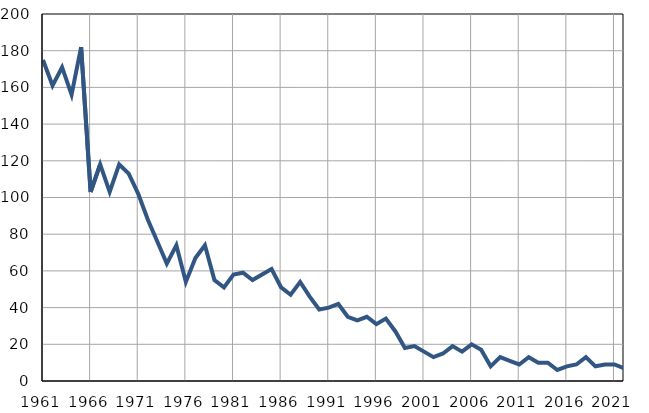
| Category | Infants
deaths |
|---|---|
| 1961.0 | 175 |
| 1962.0 | 161 |
| 1963.0 | 171 |
| 1964.0 | 156 |
| 1965.0 | 182 |
| 1966.0 | 103 |
| 1967.0 | 118 |
| 1968.0 | 103 |
| 1969.0 | 118 |
| 1970.0 | 113 |
| 1971.0 | 102 |
| 1972.0 | 88 |
| 1973.0 | 76 |
| 1974.0 | 64 |
| 1975.0 | 74 |
| 1976.0 | 54 |
| 1977.0 | 67 |
| 1978.0 | 74 |
| 1979.0 | 55 |
| 1980.0 | 51 |
| 1981.0 | 58 |
| 1982.0 | 59 |
| 1983.0 | 55 |
| 1984.0 | 58 |
| 1985.0 | 61 |
| 1986.0 | 51 |
| 1987.0 | 47 |
| 1988.0 | 54 |
| 1989.0 | 46 |
| 1990.0 | 39 |
| 1991.0 | 40 |
| 1992.0 | 42 |
| 1993.0 | 35 |
| 1994.0 | 33 |
| 1995.0 | 35 |
| 1996.0 | 31 |
| 1997.0 | 34 |
| 1998.0 | 27 |
| 1999.0 | 18 |
| 2000.0 | 19 |
| 2001.0 | 16 |
| 2002.0 | 13 |
| 2003.0 | 15 |
| 2004.0 | 19 |
| 2005.0 | 16 |
| 2006.0 | 20 |
| 2007.0 | 17 |
| 2008.0 | 8 |
| 2009.0 | 13 |
| 2010.0 | 11 |
| 2011.0 | 9 |
| 2012.0 | 13 |
| 2013.0 | 10 |
| 2014.0 | 10 |
| 2015.0 | 6 |
| 2016.0 | 8 |
| 2017.0 | 9 |
| 2018.0 | 13 |
| 2019.0 | 8 |
| 2020.0 | 9 |
| 2021.0 | 9 |
| 2022.0 | 7 |